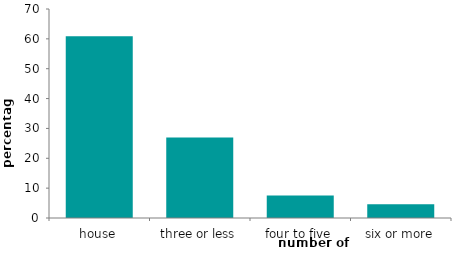
| Category | Series 0 |
|---|---|
| house | 60.882 |
| three or less | 26.989 |
| four to five | 7.539 |
| six or more | 4.59 |